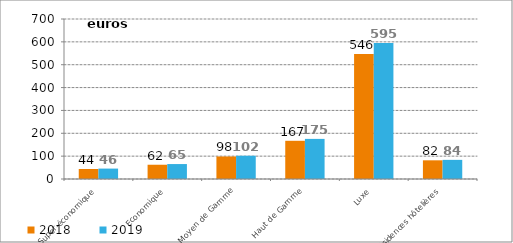
| Category | 2018 | 2019 |
|---|---|---|
| Super-économique | 43.851 | 45.56 |
| Economique | 62.394 | 65.399 |
| Moyen de Gamme | 98.499 | 101.784 |
| Haut de Gamme | 167.135 | 175.478 |
| Luxe | 546.483 | 594.66 |
| Résidences hôtelières | 81.718 | 83.722 |